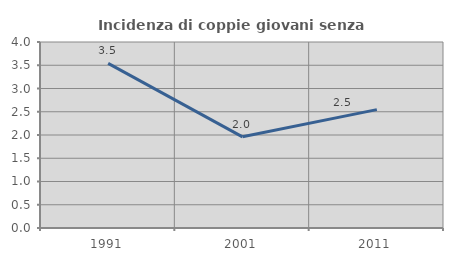
| Category | Incidenza di coppie giovani senza figli |
|---|---|
| 1991.0 | 3.54 |
| 2001.0 | 1.961 |
| 2011.0 | 2.545 |